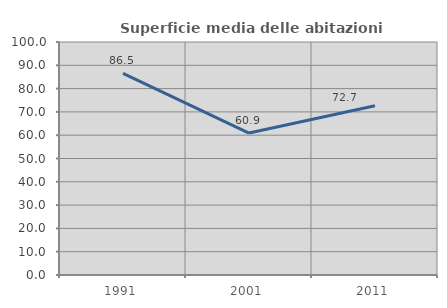
| Category | Superficie media delle abitazioni occupate |
|---|---|
| 1991.0 | 86.54 |
| 2001.0 | 60.907 |
| 2011.0 | 72.663 |